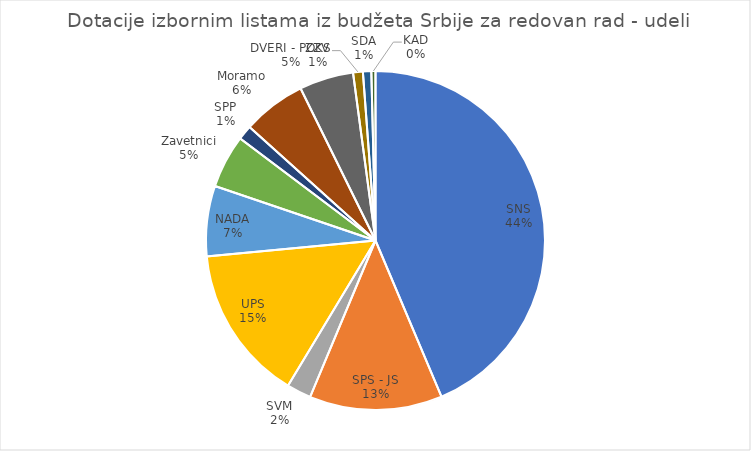
| Category | Series 2 |
|---|---|
| SNS | 603822158.397 |
| SPS - JS | 175260870.213 |
| SVM | 32314379.787 |
| UPS | 205691940.249 |
| NADA | 92812440.836 |
| Zavetnici | 70232254.729 |
| SPP | 19207642.057 |
| Moramo | 83628848.369 |
| DVERI - POKS | 71494904.932 |
| ZZV | 12871531.179 |
| SDA | 11011845.668 |
| KAD | 5446183.585 |